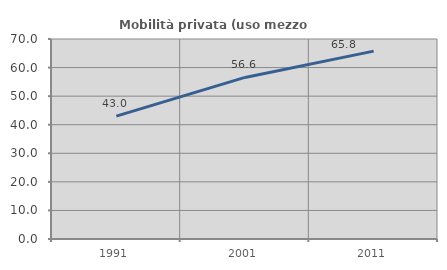
| Category | Mobilità privata (uso mezzo privato) |
|---|---|
| 1991.0 | 42.998 |
| 2001.0 | 56.557 |
| 2011.0 | 65.758 |